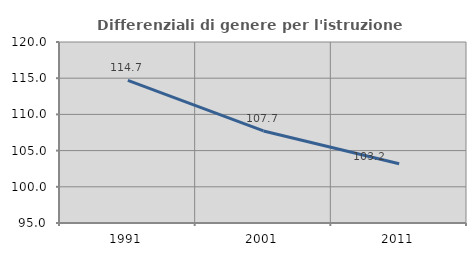
| Category | Differenziali di genere per l'istruzione superiore |
|---|---|
| 1991.0 | 114.709 |
| 2001.0 | 107.717 |
| 2011.0 | 103.18 |